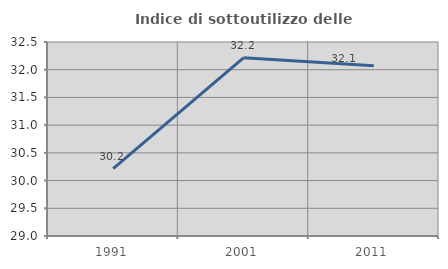
| Category | Indice di sottoutilizzo delle abitazioni  |
|---|---|
| 1991.0 | 30.215 |
| 2001.0 | 32.214 |
| 2011.0 | 32.071 |